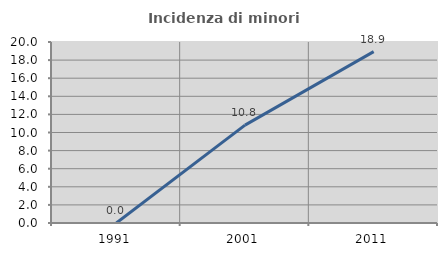
| Category | Incidenza di minori stranieri |
|---|---|
| 1991.0 | 0 |
| 2001.0 | 10.811 |
| 2011.0 | 18.939 |